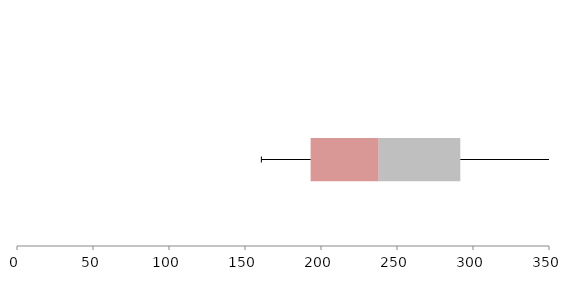
| Category | Series 1 | Series 2 | Series 3 |
|---|---|---|---|
| 0 | 193.17 | 44.791 | 53.678 |